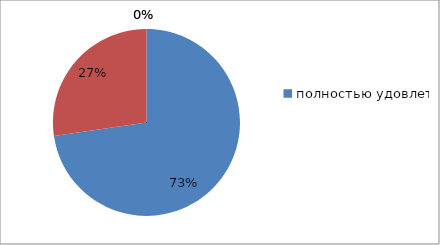
| Category | Series 0 | Series 1 |
|---|---|---|
| полностью удовлетворены | 72.7 | 72.7 |
| частично удовлетворены | 27.3 | 27.3 |
| не удовлетворены | 0 | 0 |